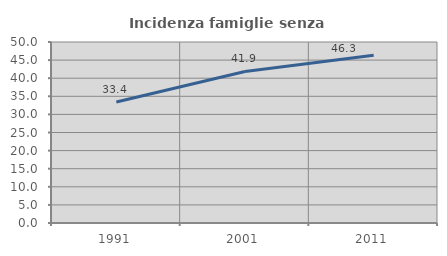
| Category | Incidenza famiglie senza nuclei |
|---|---|
| 1991.0 | 33.436 |
| 2001.0 | 41.86 |
| 2011.0 | 46.348 |